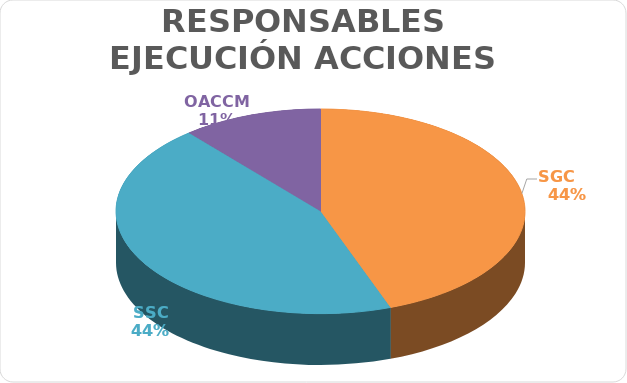
| Category | Series 0 |
|---|---|
| SGC     | 4 |
| SSC | 4 |
| OACCM | 1 |